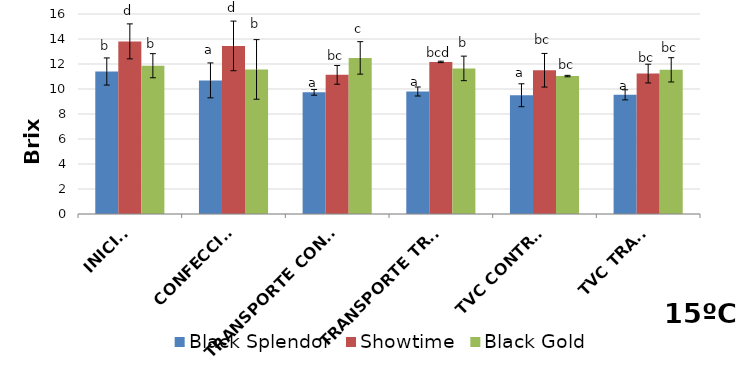
| Category | Black Splendor | Showtime | Black Gold |
|---|---|---|---|
| INICIAL | 11.4 | 13.81 | 11.863 |
| CONFECCIÓN | 10.69 | 13.447 | 11.567 |
| TRANSPORTE CONTROL | 9.733 | 11.133 | 12.488 |
| TRANSPORTE TRAT. | 9.8 | 12.167 | 11.647 |
| TVC CONTROL | 9.5 | 11.5 | 11.033 |
| TVC TRAT. | 9.533 | 11.233 | 11.533 |